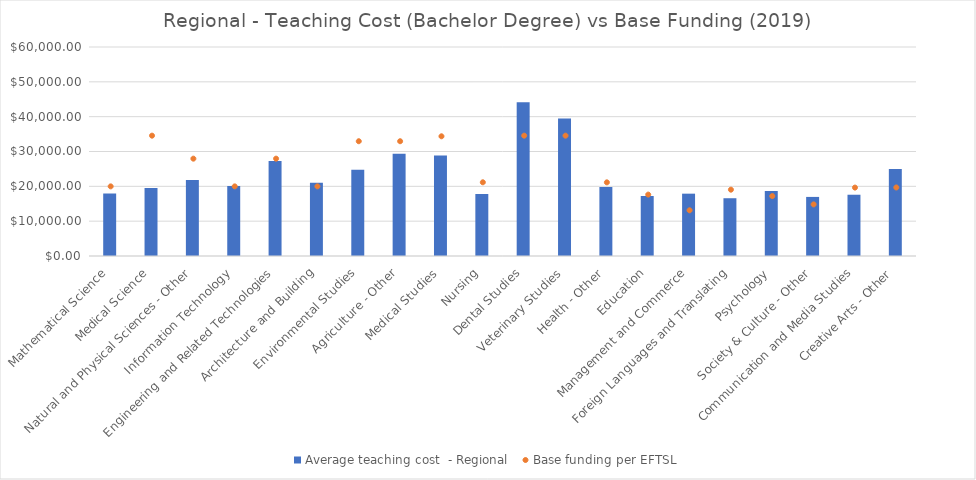
| Category | Average teaching cost  - Regional  |
|---|---|
| Mathematical Science | 17941.416 |
| Medical Science | 19524.219 |
| Natural and Physical Sciences - Other | 21812.191 |
| Information Technology | 20098.151 |
| Engineering and Related Technologies | 27265.123 |
| Architecture and Building | 21027.394 |
| Environmental Studies | 24770.292 |
| Agriculture - Other | 29357.422 |
| Medical Studies | 28836.109 |
| Nursing | 17807.362 |
| Dental Studies | 44128.906 |
| Veterinary Studies | 39473.746 |
| Health - Other | 19839.008 |
| Education | 17218 |
| Management and Commerce | 17895.379 |
| Foreign Languages and Translating | 16584.614 |
| Psychology | 18624.939 |
| Society & Culture - Other | 16962.125 |
| Communication and Media Studies | 17589.385 |
| Creative Arts - Other | 24946.603 |